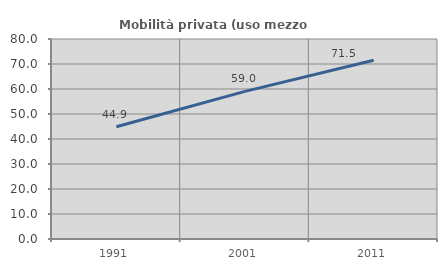
| Category | Mobilità privata (uso mezzo privato) |
|---|---|
| 1991.0 | 44.873 |
| 2001.0 | 59.038 |
| 2011.0 | 71.532 |